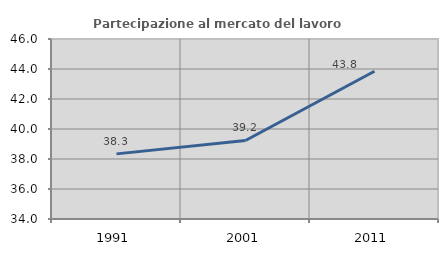
| Category | Partecipazione al mercato del lavoro  femminile |
|---|---|
| 1991.0 | 38.342 |
| 2001.0 | 39.235 |
| 2011.0 | 43.85 |